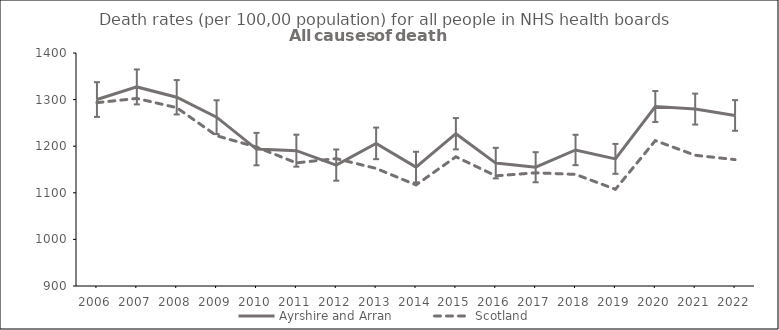
| Category | Ayrshire and Arran | Scotland |
|---|---|---|
| 2006.0 | 1300.1 | 1293.4 |
| 2007.0 | 1327.2 | 1302.5 |
| 2008.0 | 1305 | 1282.7 |
| 2009.0 | 1262.3 | 1222.5 |
| 2010.0 | 1193.8 | 1198.2 |
| 2011.0 | 1190.4 | 1164.2 |
| 2012.0 | 1159.5 | 1173.4 |
| 2013.0 | 1206.1 | 1152.3 |
| 2014.0 | 1155.1 | 1116.9 |
| 2015.0 | 1226.8 | 1177.3 |
| 2016.0 | 1163.7 | 1136.4 |
| 2017.0 | 1154.9 | 1142.9 |
| 2018.0 | 1191.9 | 1139.5 |
| 2019.0 | 1172.8 | 1107.6 |
| 2020.0 | 1285.2 | 1212 |
| 2021.0 | 1279.6 | 1180.6 |
| 2022.0 | 1266 | 1171.2 |